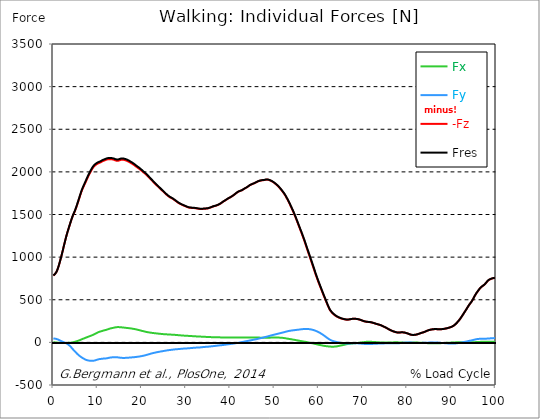
| Category |  Fx |  Fy |  -Fz |  Fres |
|---|---|---|---|---|
| 0.0 | 1.08 | 46.46 | 783.31 | 784.85 |
| 0.1646090534979424 | 0.5 | 45.14 | 791.34 | 792.79 |
| 0.3292181069958848 | -0.08 | 43.83 | 799.38 | 800.73 |
| 0.5041152263374485 | -0.64 | 42.35 | 808.45 | 809.69 |
| 0.668724279835391 | -1.29 | 40.46 | 822.41 | 823.54 |
| 0.8333333333333333 | -2.3 | 37.87 | 841.13 | 842.12 |
| 0.9979423868312757 | -3.42 | 34.49 | 864.68 | 865.53 |
| 1.162551440329218 | -4.56 | 30.8 | 890.39 | 891.1 |
| 1.337448559670782 | -5.6 | 26.63 | 919.9 | 920.49 |
| 1.5020576131687242 | -6.56 | 22.34 | 950.5 | 950.99 |
| 1.6666666666666665 | -7.1 | 17.97 | 982.89 | 983.27 |
| 1.831275720164609 | -7.52 | 13.86 | 1016.66 | 1016.96 |
| 1.9958847736625513 | -7.98 | 9.88 | 1050.57 | 1050.81 |
| 2.170781893004115 | -7.83 | 6.13 | 1085.99 | 1086.18 |
| 2.3353909465020575 | -7.66 | 2.67 | 1121.96 | 1122.13 |
| 2.4999999999999996 | -7.46 | -0.9 | 1157.16 | 1157.31 |
| 2.6646090534979425 | -7.31 | -4.56 | 1192.47 | 1192.63 |
| 2.829218106995885 | -7.09 | -8.45 | 1226.81 | 1226.99 |
| 3.0041152263374484 | -6.83 | -13.2 | 1258.89 | 1259.14 |
| 3.168724279835391 | -6.42 | -18.64 | 1289.01 | 1289.35 |
| 3.333333333333333 | -5.85 | -24.58 | 1317.21 | 1317.68 |
| 3.497942386831276 | -5.23 | -30.91 | 1344.87 | 1345.48 |
| 3.662551440329218 | -4.57 | -37.94 | 1372.54 | 1373.36 |
| 3.837448559670782 | -3.75 | -46.22 | 1399.84 | 1400.98 |
| 4.002057613168724 | -2.88 | -55.55 | 1426.32 | 1427.86 |
| 4.166666666666667 | -1.84 | -65.66 | 1451.56 | 1453.55 |
| 4.3312757201646095 | -0.62 | -76.15 | 1476.06 | 1478.5 |
| 4.495884773662552 | 1.18 | -86.2 | 1498.1 | 1501.04 |
| 4.670781893004115 | 3.71 | -95.17 | 1517.16 | 1520.64 |
| 4.835390946502058 | 6.23 | -104.14 | 1536.21 | 1540.24 |
| 4.999999999999999 | 8.91 | -113.17 | 1558.21 | 1562.84 |
| 5.164609053497943 | 11.56 | -122.19 | 1582.37 | 1587.6 |
| 5.329218106995885 | 14.14 | -131.2 | 1607.65 | 1613.5 |
| 5.504115226337448 | 17.06 | -139.61 | 1633.36 | 1639.85 |
| 5.668724279835391 | 20.01 | -147.56 | 1659.43 | 1666.53 |
| 5.833333333333333 | 23.19 | -154.88 | 1686.28 | 1693.96 |
| 5.997942386831276 | 26.53 | -161.86 | 1713.54 | 1721.77 |
| 6.162551440329218 | 30.54 | -167.63 | 1740.51 | 1749.25 |
| 6.337448559670782 | 34.24 | -173.91 | 1765.51 | 1774.82 |
| 6.502057613168724 | 37.85 | -179.99 | 1788.21 | 1798.04 |
| 6.666666666666666 | 41.45 | -185.16 | 1808.55 | 1818.85 |
| 6.831275720164609 | 44.85 | -190.07 | 1827.87 | 1838.62 |
| 6.995884773662552 | 48.04 | -194.78 | 1846.44 | 1857.62 |
| 7.170781893004115 | 51.56 | -199.68 | 1865.25 | 1876.85 |
| 7.3353909465020575 | 55.05 | -204.14 | 1884.24 | 1896.24 |
| 7.500000000000001 | 58.46 | -207.18 | 1903.75 | 1916.05 |
| 7.664609053497942 | 61.95 | -209.72 | 1923.15 | 1935.71 |
| 7.829218106995885 | 65.31 | -211.62 | 1941.64 | 1954.38 |
| 8.004115226337449 | 68.63 | -213.26 | 1959.13 | 1972.05 |
| 8.168724279835391 | 71.96 | -214.74 | 1976.33 | 1989.41 |
| 8.333333333333334 | 75.1 | -215.53 | 1993.02 | 2006.19 |
| 8.497942386831278 | 78.24 | -215.84 | 2009.23 | 2022.44 |
| 8.662551440329219 | 81.34 | -215.88 | 2025.05 | 2038.29 |
| 8.837448559670783 | 84.87 | -215.75 | 2039.29 | 2052.57 |
| 9.002057613168725 | 88.82 | -215.52 | 2052.07 | 2065.41 |
| 9.166666666666668 | 92.97 | -214.73 | 2063.45 | 2076.82 |
| 9.33127572016461 | 97.17 | -212.85 | 2072.36 | 2085.7 |
| 9.495884773662551 | 101.88 | -210.24 | 2079.29 | 2092.57 |
| 9.670781893004117 | 106.45 | -207.43 | 2085.62 | 2098.84 |
| 9.83539094650206 | 110.84 | -204.61 | 2091.74 | 2104.9 |
| 9.999999999999998 | 115.72 | -201.67 | 2096.78 | 2109.91 |
| 10.16460905349794 | 119.63 | -199.12 | 2101.18 | 2114.27 |
| 10.329218106995887 | 122.93 | -196.95 | 2104.66 | 2117.74 |
| 10.504115226337447 | 125.93 | -194.96 | 2107.68 | 2120.77 |
| 10.66872427983539 | 128.24 | -194.04 | 2111.69 | 2124.83 |
| 10.833333333333334 | 130.44 | -193.43 | 2116.26 | 2129.46 |
| 10.997942386831275 | 132.83 | -192.88 | 2121.5 | 2134.76 |
| 11.162551440329217 | 135.83 | -191.75 | 2125.97 | 2139.27 |
| 11.337448559670783 | 139.35 | -189.95 | 2129.77 | 2143.1 |
| 11.502057613168724 | 141.45 | -189.66 | 2131.91 | 2145.33 |
| 11.666666666666666 | 142.97 | -189.77 | 2136.55 | 2150.03 |
| 11.831275720164609 | 144.97 | -189.06 | 2140.52 | 2154.03 |
| 11.995884773662551 | 147.75 | -187.49 | 2143.53 | 2157.06 |
| 12.170781893004115 | 150.92 | -185.46 | 2145.81 | 2159.36 |
| 12.335390946502057 | 153.57 | -183.84 | 2147.81 | 2161.39 |
| 12.5 | 157.15 | -181.51 | 2149.02 | 2162.63 |
| 12.664609053497943 | 159.87 | -179.78 | 2149.58 | 2163.26 |
| 12.829218106995885 | 162.52 | -178.17 | 2149.66 | 2163.41 |
| 13.004115226337449 | 164.75 | -177.25 | 2149.22 | 2163.09 |
| 13.168724279835391 | 166.68 | -176.24 | 2148.14 | 2162.08 |
| 13.333333333333332 | 168.49 | -175.4 | 2146.77 | 2160.78 |
| 13.497942386831276 | 170.23 | -174.85 | 2144.87 | 2158.99 |
| 13.662551440329217 | 171.94 | -174.46 | 2142.59 | 2156.83 |
| 13.837448559670783 | 173.79 | -174.34 | 2139.29 | 2153.7 |
| 14.002057613168724 | 175.8 | -174.27 | 2135.51 | 2150.1 |
| 14.166666666666666 | 177.57 | -174.35 | 2132.27 | 2147.03 |
| 14.33127572016461 | 178.51 | -174.81 | 2130.11 | 2145 |
| 14.495884773662551 | 178.99 | -175.42 | 2129.68 | 2144.67 |
| 14.670781893004115 | 179.38 | -176.42 | 2130.7 | 2145.79 |
| 14.835390946502057 | 179.14 | -177.7 | 2133 | 2148.15 |
| 15.000000000000002 | 178.48 | -178.98 | 2136.27 | 2151.44 |
| 15.164609053497943 | 177.73 | -180.11 | 2139.85 | 2155.03 |
| 15.329218106995883 | 176.73 | -181.05 | 2142.15 | 2157.29 |
| 15.504115226337449 | 175.98 | -181.73 | 2142.82 | 2157.96 |
| 15.66872427983539 | 174.97 | -182.15 | 2142.66 | 2157.75 |
| 15.833333333333334 | 174.03 | -182.2 | 2141.8 | 2156.82 |
| 15.997942386831276 | 173.21 | -182.17 | 2140.07 | 2155.03 |
| 16.162551440329217 | 172 | -182.1 | 2137.96 | 2152.83 |
| 16.337448559670783 | 170.82 | -181.73 | 2135.44 | 2150.21 |
| 16.502057613168724 | 169.79 | -181.13 | 2132.71 | 2147.37 |
| 16.666666666666668 | 168.99 | -180.72 | 2129.21 | 2143.8 |
| 16.83127572016461 | 168.16 | -180.08 | 2125 | 2139.49 |
| 16.995884773662556 | 167.13 | -179.4 | 2120.45 | 2134.84 |
| 17.170781893004115 | 166.16 | -178.72 | 2115.46 | 2129.75 |
| 17.33539094650206 | 164.96 | -177.91 | 2110.34 | 2124.5 |
| 17.500000000000004 | 163.82 | -177.07 | 2105.29 | 2119.33 |
| 17.66460905349794 | 162.55 | -176.3 | 2100.06 | 2113.98 |
| 17.82921810699589 | 161.08 | -175.57 | 2094.71 | 2108.49 |
| 18.00411522633745 | 159.56 | -174.89 | 2089.19 | 2102.82 |
| 18.16872427983539 | 158 | -174.18 | 2083.58 | 2097.07 |
| 18.333333333333336 | 156.2 | -173.31 | 2077.33 | 2090.65 |
| 18.497942386831276 | 154.45 | -172.4 | 2070.66 | 2083.82 |
| 18.66255144032922 | 152.75 | -171.33 | 2063.84 | 2076.83 |
| 18.837448559670786 | 150.91 | -170.15 | 2057.31 | 2070.11 |
| 19.002057613168724 | 148.95 | -168.96 | 2051.1 | 2063.69 |
| 19.166666666666668 | 146.61 | -167.85 | 2045.44 | 2057.8 |
| 19.331275720164612 | 144.28 | -166.6 | 2039.35 | 2051.48 |
| 19.495884773662553 | 142.01 | -165.24 | 2032.73 | 2044.63 |
| 19.67078189300412 | 139.77 | -163.84 | 2025.78 | 2037.45 |
| 19.83539094650206 | 137.47 | -162.34 | 2018.65 | 2030.08 |
| 19.999999999999996 | 135.36 | -160.62 | 2011.25 | 2022.44 |
| 20.164609053497944 | 133.26 | -158.75 | 2003.73 | 2014.68 |
| 20.32921810699588 | 131.14 | -156.82 | 1996.4 | 2007.11 |
| 20.504115226337447 | 129 | -154.73 | 1989 | 1999.45 |
| 20.66872427983539 | 126.94 | -152.57 | 1982.1 | 1992.29 |
| 20.833333333333332 | 124.96 | -150.4 | 1975.33 | 1985.26 |
| 20.997942386831276 | 122.78 | -148.13 | 1967.81 | 1977.45 |
| 21.162551440329217 | 121.03 | -145.78 | 1959.53 | 1968.92 |
| 21.33744855967078 | 119.38 | -143.3 | 1950.6 | 1959.74 |
| 21.502057613168724 | 117.92 | -140.84 | 1941.75 | 1950.65 |
| 21.666666666666668 | 116.48 | -138.32 | 1932.56 | 1941.24 |
| 21.83127572016461 | 115.03 | -135.53 | 1923.08 | 1931.52 |
| 21.99588477366255 | 113.64 | -132.97 | 1913.92 | 1922.13 |
| 22.170781893004115 | 112.36 | -130.65 | 1905.2 | 1913.21 |
| 22.335390946502056 | 111.23 | -128.33 | 1896.55 | 1904.37 |
| 22.5 | 110.14 | -126.1 | 1887.71 | 1895.34 |
| 22.664609053497944 | 109.05 | -124.01 | 1878.65 | 1886.12 |
| 22.82921810699588 | 108.09 | -122.04 | 1869.71 | 1877.02 |
| 23.004115226337447 | 107.2 | -120.23 | 1860.94 | 1868.12 |
| 23.16872427983539 | 106.12 | -118.31 | 1852.09 | 1859.12 |
| 23.333333333333332 | 105.14 | -116.43 | 1843.77 | 1850.66 |
| 23.497942386831276 | 104.08 | -114.47 | 1836.31 | 1843.04 |
| 23.662551440329217 | 103.1 | -112.66 | 1827.95 | 1834.54 |
| 23.83744855967078 | 102.2 | -110.98 | 1819.43 | 1825.89 |
| 24.002057613168727 | 101.29 | -109.52 | 1811.26 | 1817.62 |
| 24.166666666666664 | 100.33 | -108.02 | 1803.05 | 1809.29 |
| 24.33127572016461 | 99.35 | -106.47 | 1794.86 | 1800.98 |
| 24.495884773662553 | 98.46 | -104.9 | 1786.4 | 1792.41 |
| 24.670781893004115 | 97.56 | -103.45 | 1778.11 | 1784.01 |
| 24.83539094650206 | 96.74 | -101.95 | 1769.78 | 1775.57 |
| 25.0 | 96.04 | -100.41 | 1761.46 | 1767.15 |
| 25.164609053497944 | 95.48 | -98.8 | 1753.18 | 1758.78 |
| 25.329218106995885 | 94.97 | -97.15 | 1744.96 | 1750.46 |
| 25.504115226337447 | 94.45 | -95.66 | 1737.06 | 1742.48 |
| 25.66872427983539 | 93.93 | -94.26 | 1729.39 | 1734.74 |
| 25.833333333333332 | 93.49 | -92.88 | 1722.05 | 1727.32 |
| 25.997942386831276 | 92.97 | -91.64 | 1714.98 | 1720.19 |
| 26.16255144032922 | 92.4 | -90.47 | 1708.41 | 1713.56 |
| 26.337448559670783 | 91.79 | -89.44 | 1702.41 | 1707.49 |
| 26.502057613168724 | 91.32 | -88.45 | 1697.95 | 1702.97 |
| 26.666666666666664 | 90.84 | -87.46 | 1693.5 | 1698.46 |
| 26.83127572016461 | 90.38 | -86.4 | 1688.89 | 1693.78 |
| 26.995884773662553 | 89.96 | -85.21 | 1683.99 | 1688.8 |
| 27.170781893004115 | 89.39 | -84 | 1678.11 | 1682.85 |
| 27.33539094650206 | 88.8 | -82.84 | 1671.74 | 1676.4 |
| 27.499999999999996 | 88.19 | -81.84 | 1665.56 | 1670.16 |
| 27.66460905349794 | 87.39 | -81.11 | 1659.25 | 1663.8 |
| 27.829218106995885 | 86.59 | -80.42 | 1652.81 | 1657.3 |
| 28.004115226337447 | 85.77 | -79.7 | 1646.19 | 1650.62 |
| 28.16872427983539 | 84.9 | -79.01 | 1639.86 | 1644.22 |
| 28.333333333333332 | 84.11 | -78.19 | 1633.96 | 1638.26 |
| 28.49794238683128 | 83.35 | -77.42 | 1629.12 | 1633.35 |
| 28.66255144032922 | 82.66 | -76.6 | 1624.56 | 1628.74 |
| 28.837448559670783 | 81.96 | -75.66 | 1620.26 | 1624.37 |
| 29.002057613168724 | 81.28 | -74.89 | 1616.07 | 1620.13 |
| 29.166666666666664 | 80.61 | -74.17 | 1611.93 | 1615.94 |
| 29.331275720164612 | 79.98 | -73.41 | 1607.99 | 1611.95 |
| 29.495884773662553 | 79.31 | -72.78 | 1604.33 | 1608.24 |
| 29.670781893004115 | 78.68 | -72.3 | 1600.81 | 1604.68 |
| 29.835390946502056 | 78.13 | -71.74 | 1597.32 | 1601.14 |
| 30.000000000000004 | 77.64 | -71.26 | 1593.69 | 1597.48 |
| 30.164609053497944 | 77.19 | -70.82 | 1589.65 | 1593.41 |
| 30.329218106995885 | 76.69 | -70.25 | 1586.24 | 1589.95 |
| 30.504115226337447 | 76.19 | -69.54 | 1583.28 | 1586.95 |
| 30.66872427983539 | 75.71 | -68.74 | 1580.84 | 1584.45 |
| 30.833333333333336 | 75.17 | -67.97 | 1579.26 | 1582.82 |
| 30.99794238683128 | 74.58 | -67.17 | 1578.22 | 1581.72 |
| 31.162551440329217 | 74.13 | -66.35 | 1577.5 | 1580.95 |
| 31.33744855967078 | 73.54 | -65.65 | 1576.97 | 1580.37 |
| 31.50205761316873 | 73.03 | -64.85 | 1576.53 | 1579.87 |
| 31.666666666666668 | 72.56 | -63.99 | 1576.02 | 1579.31 |
| 31.831275720164612 | 72.07 | -63.17 | 1575.28 | 1578.52 |
| 31.995884773662553 | 71.47 | -62.47 | 1574.36 | 1577.54 |
| 32.17078189300411 | 70.79 | -61.88 | 1573.28 | 1576.41 |
| 32.33539094650206 | 70.11 | -61.42 | 1571.96 | 1575.05 |
| 32.5 | 69.63 | -60.99 | 1570.45 | 1573.5 |
| 32.66460905349794 | 69.3 | -60.61 | 1568.62 | 1571.65 |
| 32.82921810699589 | 68.89 | -60.19 | 1567.06 | 1570.05 |
| 33.00411522633745 | 68.41 | -59.7 | 1566.01 | 1568.96 |
| 33.168724279835395 | 67.98 | -59.14 | 1565.32 | 1568.23 |
| 33.333333333333336 | 67.49 | -58.28 | 1565.14 | 1567.99 |
| 33.49794238683128 | 67.08 | -57.28 | 1565.21 | 1567.99 |
| 33.66255144032922 | 66.7 | -56.15 | 1565.4 | 1568.11 |
| 33.83744855967078 | 66.34 | -55.18 | 1565.84 | 1568.5 |
| 34.00205761316873 | 65.77 | -54.33 | 1566.59 | 1569.2 |
| 34.16666666666667 | 65.17 | -53.54 | 1567.41 | 1569.96 |
| 34.331275720164605 | 64.67 | -52.95 | 1568.22 | 1570.73 |
| 34.49588477366255 | 64.26 | -52.37 | 1569.02 | 1571.49 |
| 34.67078189300412 | 64.14 | -51.81 | 1569.75 | 1572.2 |
| 34.83539094650206 | 63.89 | -51.26 | 1570.86 | 1573.29 |
| 35.00000000000001 | 63.55 | -50.54 | 1572.48 | 1574.86 |
| 35.16460905349794 | 63.08 | -49.57 | 1574.96 | 1577.3 |
| 35.32921810699588 | 62.53 | -48.54 | 1577.88 | 1580.16 |
| 35.504115226337454 | 61.94 | -47.51 | 1581.1 | 1583.32 |
| 35.668724279835395 | 61.44 | -46.65 | 1584.48 | 1586.65 |
| 35.833333333333336 | 61.01 | -45.88 | 1587.96 | 1590.09 |
| 35.99794238683128 | 60.82 | -44.98 | 1591.64 | 1593.74 |
| 36.16255144032922 | 60.6 | -44 | 1594.65 | 1596.7 |
| 36.33744855967078 | 60.34 | -43.01 | 1597.42 | 1599.43 |
| 36.50205761316873 | 60.12 | -42.02 | 1599.78 | 1601.75 |
| 36.66666666666667 | 59.96 | -40.91 | 1601.81 | 1603.76 |
| 36.831275720164605 | 59.72 | -39.79 | 1604.64 | 1606.54 |
| 36.99588477366255 | 59.48 | -38.72 | 1607.87 | 1609.75 |
| 37.17078189300412 | 59.27 | -37.65 | 1611.36 | 1613.21 |
| 37.33539094650206 | 59.05 | -36.58 | 1615.29 | 1617.11 |
| 37.5 | 58.89 | -35.53 | 1619.8 | 1621.59 |
| 37.66460905349794 | 58.71 | -34.65 | 1624.61 | 1626.37 |
| 37.82921810699589 | 58.5 | -33.79 | 1629.58 | 1631.32 |
| 38.00411522633745 | 58.27 | -32.87 | 1635.46 | 1637.17 |
| 38.168724279835395 | 58 | -31.85 | 1642.37 | 1644.07 |
| 38.333333333333336 | 57.92 | -30.87 | 1648.43 | 1650.1 |
| 38.49794238683127 | 57.92 | -29.72 | 1653.79 | 1655.43 |
| 38.662551440329224 | 57.86 | -28.51 | 1659.13 | 1660.74 |
| 38.83744855967078 | 57.75 | -27.41 | 1664.81 | 1666.4 |
| 39.00205761316872 | 57.63 | -26.29 | 1670.37 | 1671.94 |
| 39.16666666666667 | 57.51 | -25 | 1675.92 | 1677.46 |
| 39.331275720164605 | 57.4 | -23.74 | 1681.38 | 1682.88 |
| 39.49588477366255 | 57.34 | -22.51 | 1686.96 | 1688.44 |
| 39.67078189300412 | 57.3 | -21.39 | 1692.6 | 1694.06 |
| 39.83539094650206 | 57.19 | -20.28 | 1697.4 | 1698.84 |
| 39.99999999999999 | 57.11 | -19.23 | 1701.33 | 1702.76 |
| 40.16460905349794 | 57.01 | -18.14 | 1706.11 | 1707.52 |
| 40.32921810699589 | 56.89 | -16.95 | 1711.61 | 1713.01 |
| 40.50411522633745 | 56.78 | -15.73 | 1717.27 | 1718.66 |
| 40.668724279835395 | 56.78 | -14.51 | 1723.29 | 1724.67 |
| 40.83333333333333 | 56.8 | -13.16 | 1729.89 | 1731.26 |
| 40.99794238683128 | 56.79 | -11.77 | 1736.44 | 1737.8 |
| 41.16255144032922 | 56.78 | -10.27 | 1743.26 | 1744.63 |
| 41.33744855967078 | 56.74 | -8.83 | 1750.3 | 1751.65 |
| 41.50205761316872 | 56.82 | -7.5 | 1756.87 | 1758.21 |
| 41.666666666666664 | 57 | -6.15 | 1762.78 | 1764.14 |
| 41.83127572016461 | 57.09 | -4.49 | 1767.82 | 1769.19 |
| 41.99588477366255 | 57.08 | -2.79 | 1771.92 | 1773.29 |
| 42.17078189300412 | 57.26 | -1.2 | 1775.43 | 1776.78 |
| 42.33539094650206 | 57.37 | 0.47 | 1778.54 | 1779.87 |
| 42.5 | 57.53 | 2.21 | 1781.47 | 1782.79 |
| 42.66460905349794 | 57.83 | 3.91 | 1784.99 | 1786.31 |
| 42.82921810699589 | 57.91 | 5.58 | 1790.17 | 1791.5 |
| 43.00411522633745 | 57.8 | 7.49 | 1796.35 | 1797.68 |
| 43.16872427983539 | 57.63 | 9.42 | 1802.36 | 1803.68 |
| 43.333333333333336 | 57.68 | 11.13 | 1807.2 | 1808.52 |
| 43.49794238683128 | 57.93 | 12.65 | 1811.52 | 1812.85 |
| 43.66255144032922 | 58.14 | 14.19 | 1815.99 | 1817.33 |
| 43.83744855967078 | 58.22 | 15.9 | 1821.34 | 1822.7 |
| 44.00205761316873 | 58.33 | 17.67 | 1827.71 | 1829.09 |
| 44.166666666666664 | 58.35 | 19.43 | 1834.47 | 1835.86 |
| 44.33127572016461 | 58.23 | 21.24 | 1840.68 | 1842.07 |
| 44.49588477366255 | 57.99 | 23.1 | 1845.73 | 1847.12 |
| 44.67078189300411 | 57.76 | 24.72 | 1850.16 | 1851.57 |
| 44.835390946502066 | 57.78 | 26.24 | 1853.91 | 1855.34 |
| 45.0 | 57.91 | 27.94 | 1857.18 | 1858.65 |
| 45.16460905349794 | 58.1 | 29.65 | 1860.64 | 1862.13 |
| 45.32921810699589 | 58.04 | 31.44 | 1864.72 | 1866.24 |
| 45.504115226337454 | 57.88 | 33.32 | 1868.8 | 1870.34 |
| 45.668724279835395 | 57.7 | 35.21 | 1872.89 | 1874.45 |
| 45.83333333333333 | 57.46 | 36.92 | 1877.17 | 1878.75 |
| 45.99794238683128 | 57.07 | 38.75 | 1881.47 | 1883.07 |
| 46.16255144032922 | 56.45 | 40.78 | 1885.8 | 1887.41 |
| 46.33744855967078 | 56.13 | 42.89 | 1889.78 | 1891.41 |
| 46.50205761316873 | 55.85 | 45.03 | 1893.23 | 1894.89 |
| 46.666666666666664 | 55.66 | 47.21 | 1895.86 | 1897.55 |
| 46.831275720164605 | 55.52 | 49.17 | 1897.7 | 1899.41 |
| 46.99588477366255 | 55.44 | 51.15 | 1899.71 | 1901.45 |
| 47.17078189300412 | 55.52 | 53.23 | 1901.3 | 1903.09 |
| 47.33539094650206 | 55.53 | 55.24 | 1902.2 | 1904.04 |
| 47.5 | 55.64 | 57.26 | 1902.71 | 1904.59 |
| 47.66460905349794 | 55.76 | 59.39 | 1903.73 | 1905.66 |
| 47.82921810699588 | 55.57 | 61.44 | 1905.85 | 1907.82 |
| 48.004115226337454 | 55.31 | 63.56 | 1907.91 | 1909.93 |
| 48.168724279835395 | 54.88 | 65.81 | 1909.48 | 1911.55 |
| 48.33333333333333 | 54.59 | 68.08 | 1909.77 | 1911.92 |
| 48.49794238683128 | 54.69 | 70.48 | 1908.29 | 1910.53 |
| 48.66255144032922 | 54.94 | 72.94 | 1905.99 | 1908.33 |
| 48.83744855967078 | 55.2 | 75.61 | 1903 | 1905.45 |
| 49.00205761316873 | 55.53 | 78.12 | 1899.67 | 1902.24 |
| 49.166666666666664 | 55.81 | 80.5 | 1895.74 | 1898.43 |
| 49.331275720164605 | 56.08 | 82.77 | 1891.55 | 1894.35 |
| 49.49588477366255 | 56.15 | 84.92 | 1886.59 | 1889.49 |
| 49.67078189300412 | 56.18 | 87 | 1881.35 | 1884.36 |
| 49.83539094650206 | 56.15 | 88.99 | 1875.75 | 1878.87 |
| 50.0 | 56.11 | 91.15 | 1869.01 | 1872.25 |
| 50.16460905349794 | 56.43 | 93.51 | 1862.11 | 1865.49 |
| 50.32921810699589 | 56.51 | 95.78 | 1855.12 | 1858.61 |
| 50.504115226337454 | 56.47 | 97.85 | 1847.51 | 1851.12 |
| 50.668724279835395 | 56.37 | 99.96 | 1839.21 | 1842.96 |
| 50.83333333333333 | 56.16 | 102.04 | 1830.63 | 1834.5 |
| 50.99794238683128 | 55.95 | 104.06 | 1821.62 | 1825.62 |
| 51.162551440329224 | 55.65 | 106.17 | 1811.54 | 1815.67 |
| 51.33744855967078 | 55.25 | 108.25 | 1801.35 | 1805.61 |
| 51.50205761316873 | 54.69 | 110.37 | 1790.87 | 1795.26 |
| 51.666666666666664 | 53.95 | 112.63 | 1779.9 | 1784.44 |
| 51.83127572016461 | 53.07 | 114.96 | 1768.86 | 1773.53 |
| 51.99588477366255 | 51.92 | 117.16 | 1757.02 | 1761.84 |
| 52.17078189300412 | 50.7 | 119.53 | 1744.68 | 1749.66 |
| 52.335390946502066 | 49.35 | 121.82 | 1731.48 | 1736.61 |
| 52.5 | 47.87 | 124.14 | 1717.24 | 1722.55 |
| 52.66460905349795 | 46.25 | 126.55 | 1701.76 | 1707.24 |
| 52.82921810699588 | 44.68 | 128.89 | 1685.92 | 1691.59 |
| 53.00411522633745 | 43.16 | 131.06 | 1669.81 | 1675.66 |
| 53.1687242798354 | 41.63 | 133.07 | 1652.93 | 1658.96 |
| 53.33333333333333 | 40.17 | 134.79 | 1635.18 | 1641.38 |
| 53.49794238683128 | 38.73 | 136.19 | 1616.73 | 1623.08 |
| 53.66255144032922 | 37.31 | 137.53 | 1598.19 | 1604.69 |
| 53.83744855967078 | 35.85 | 138.81 | 1578.98 | 1585.64 |
| 54.00205761316873 | 34.43 | 140.04 | 1560.24 | 1567.06 |
| 54.166666666666664 | 32.98 | 141.19 | 1540.63 | 1547.6 |
| 54.33127572016461 | 31.43 | 142.23 | 1520.7 | 1527.83 |
| 54.495884773662546 | 29.84 | 143.34 | 1499.95 | 1507.24 |
| 54.67078189300412 | 28.2 | 144.38 | 1478.45 | 1485.92 |
| 54.835390946502066 | 26.53 | 145.48 | 1456.65 | 1464.29 |
| 54.99999999999999 | 24.92 | 146.54 | 1434.31 | 1442.15 |
| 55.16460905349795 | 23.28 | 147.56 | 1411.92 | 1419.96 |
| 55.32921810699588 | 21.67 | 148.59 | 1388.83 | 1397.09 |
| 55.50411522633745 | 20.06 | 149.67 | 1366.18 | 1374.67 |
| 55.668724279835395 | 18.48 | 150.81 | 1343.31 | 1352.06 |
| 55.83333333333333 | 16.93 | 152 | 1320.58 | 1329.6 |
| 55.99794238683128 | 15.4 | 153.27 | 1298.49 | 1307.8 |
| 56.162551440329224 | 13.83 | 154.28 | 1275.6 | 1285.19 |
| 56.33744855967078 | 12.28 | 155.23 | 1252.03 | 1261.89 |
| 56.50205761316873 | 10.74 | 155.97 | 1227.92 | 1238.06 |
| 56.666666666666664 | 9.14 | 156.7 | 1204.02 | 1214.43 |
| 56.83127572016461 | 7.57 | 157.01 | 1179.13 | 1189.79 |
| 56.99588477366256 | 6.01 | 157.08 | 1153.44 | 1164.34 |
| 57.17078189300412 | 4.4 | 156.92 | 1127.5 | 1138.62 |
| 57.335390946502066 | 2.76 | 156.78 | 1101.58 | 1112.92 |
| 57.49999999999999 | 1.12 | 156.6 | 1075.91 | 1087.47 |
| 57.66460905349794 | -0.55 | 156.2 | 1050.15 | 1061.91 |
| 57.829218106995896 | -2.24 | 155.41 | 1024.73 | 1036.65 |
| 58.00411522633745 | -4.03 | 154.29 | 999.78 | 1011.82 |
| 58.168724279835395 | -5.9 | 152.72 | 974.38 | 986.5 |
| 58.33333333333333 | -7.84 | 150.92 | 948.78 | 960.95 |
| 58.49794238683128 | -9.8 | 148.94 | 922.92 | 935.11 |
| 58.662551440329224 | -11.78 | 146.89 | 897.18 | 909.39 |
| 58.83744855967078 | -13.81 | 144.58 | 871.45 | 883.65 |
| 59.00205761316873 | -15.87 | 141.78 | 845.48 | 857.6 |
| 59.16666666666666 | -17.92 | 138.6 | 819.09 | 831.09 |
| 59.33127572016461 | -19.92 | 135.21 | 793.35 | 805.2 |
| 59.49588477366256 | -21.95 | 131.47 | 768.65 | 780.27 |
| 59.67078189300411 | -23.92 | 127.59 | 744.5 | 755.88 |
| 59.835390946502066 | -25.89 | 123.54 | 720.87 | 731.98 |
| 60.00000000000001 | -27.78 | 119.24 | 697.88 | 708.68 |
| 60.16460905349794 | -29.64 | 114.75 | 675.79 | 686.23 |
| 60.32921810699589 | -31.42 | 109.73 | 653.75 | 663.79 |
| 60.50411522633745 | -33.23 | 104.4 | 631.79 | 641.4 |
| 60.66872427983539 | -35.01 | 98.82 | 609.76 | 618.91 |
| 60.833333333333336 | -36.81 | 93.19 | 587.74 | 596.43 |
| 60.99794238683128 | -38.6 | 87.5 | 565.97 | 574.2 |
| 61.162551440329224 | -40.19 | 81.51 | 544.42 | 552.2 |
| 61.33744855967078 | -41.67 | 75.31 | 523.02 | 530.34 |
| 61.50205761316872 | -43.02 | 68.86 | 501.88 | 508.73 |
| 61.66666666666667 | -44.1 | 62.29 | 480.71 | 487.14 |
| 61.831275720164605 | -45.08 | 55.8 | 459.79 | 465.83 |
| 61.99588477366256 | -46.12 | 49.44 | 439.1 | 444.78 |
| 62.17078189300411 | -47.24 | 43.32 | 419.11 | 424.46 |
| 62.33539094650205 | -48.22 | 37.6 | 400.39 | 405.48 |
| 62.50000000000001 | -49.18 | 32.13 | 383.02 | 387.88 |
| 62.66460905349794 | -49.77 | 27.83 | 369.6 | 374.31 |
| 62.82921810699589 | -50.18 | 23.7 | 358.08 | 362.65 |
| 63.00411522633746 | -50.48 | 20 | 347.6 | 352.07 |
| 63.16872427983539 | -50.45 | 17.1 | 339.28 | 343.7 |
| 63.333333333333336 | -50.28 | 14.4 | 331.71 | 336.07 |
| 63.49794238683128 | -49.98 | 11.72 | 324.3 | 328.58 |
| 63.662551440329224 | -49.55 | 9.11 | 317.12 | 321.32 |
| 63.83744855967079 | -48.84 | 6.73 | 310.64 | 314.73 |
| 64.00205761316873 | -47.58 | 4.82 | 305.17 | 309.09 |
| 64.16666666666667 | -46.01 | 2.98 | 300.37 | 304.08 |
| 64.3312757201646 | -44.19 | 1.11 | 296.03 | 299.51 |
| 64.49588477366255 | -42.23 | -0.73 | 292.03 | 295.3 |
| 64.67078189300412 | -40.27 | -2.59 | 288.29 | 291.35 |
| 64.83539094650206 | -38.41 | -4.32 | 284.8 | 287.66 |
| 65.0 | -36.52 | -5.9 | 281.63 | 284.3 |
| 65.16460905349794 | -34.76 | -7.11 | 279.13 | 281.64 |
| 65.32921810699588 | -32.94 | -8.39 | 276.59 | 278.94 |
| 65.50411522633745 | -31.04 | -9.53 | 274.26 | 276.42 |
| 65.66872427983539 | -29.14 | -10.42 | 272.21 | 274.21 |
| 65.83333333333334 | -27.18 | -11.17 | 270.44 | 272.29 |
| 65.99794238683127 | -25.26 | -11.83 | 268.79 | 270.5 |
| 66.16255144032922 | -23.36 | -12.37 | 267.29 | 268.85 |
| 66.33744855967079 | -21.46 | -12.87 | 266.32 | 267.76 |
| 66.50205761316873 | -19.67 | -13.24 | 265.92 | 267.26 |
| 66.66666666666667 | -18.17 | -13.05 | 266.77 | 268.02 |
| 66.8312757201646 | -16.82 | -12.82 | 268.01 | 269.16 |
| 66.99588477366255 | -15.63 | -12.28 | 269.57 | 270.63 |
| 67.17078189300412 | -14.52 | -11.76 | 271.4 | 272.38 |
| 67.33539094650206 | -13.59 | -11.46 | 273.11 | 274.01 |
| 67.5 | -12.71 | -11.12 | 274.71 | 275.54 |
| 67.66460905349794 | -11.94 | -10.69 | 276.11 | 276.87 |
| 67.8292181069959 | -11.36 | -10.56 | 276.79 | 277.5 |
| 68.00411522633746 | -10.75 | -10.38 | 277.05 | 277.71 |
| 68.16872427983539 | -10.06 | -10.21 | 277 | 277.61 |
| 68.33333333333334 | -9.21 | -10.32 | 276.16 | 276.74 |
| 68.49794238683127 | -8.31 | -10.58 | 275.07 | 275.62 |
| 68.66255144032921 | -7.38 | -10.92 | 273.88 | 274.41 |
| 68.83744855967078 | -6.6 | -11.39 | 272.25 | 272.77 |
| 69.00205761316872 | -5.26 | -11.96 | 270.23 | 270.76 |
| 69.16666666666667 | -3.88 | -12.6 | 268.07 | 268.62 |
| 69.33127572016461 | -2.7 | -13.23 | 265.47 | 266.08 |
| 69.49588477366255 | -1.58 | -14.01 | 262.41 | 263.07 |
| 69.67078189300412 | -0.75 | -14.82 | 259.05 | 259.75 |
| 69.83539094650206 | 0.13 | -15.67 | 255.54 | 256.31 |
| 70.00000000000001 | 1.18 | -16.49 | 252.22 | 253.05 |
| 70.16460905349794 | 2.2 | -17.25 | 249.25 | 250.12 |
| 70.32921810699588 | 3.46 | -17.94 | 246.6 | 247.52 |
| 70.50411522633745 | 4.84 | -18.27 | 244.57 | 245.52 |
| 70.66872427983539 | 5.81 | -18.65 | 242.75 | 243.76 |
| 70.83333333333333 | 6.37 | -18.78 | 241.35 | 242.38 |
| 70.99794238683128 | 6.96 | -18.82 | 240.21 | 241.27 |
| 71.16255144032922 | 7.24 | -18.71 | 239.37 | 240.44 |
| 71.33744855967079 | 7.4 | -18.57 | 238.72 | 239.8 |
| 71.50205761316873 | 7.28 | -18.38 | 237.82 | 238.88 |
| 71.66666666666667 | 6.82 | -18.13 | 236.61 | 237.64 |
| 71.83127572016461 | 6.35 | -17.98 | 235.02 | 236.03 |
| 71.99588477366255 | 5.89 | -17.93 | 233.03 | 234.05 |
| 72.17078189300412 | 5.5 | -17.87 | 230.44 | 231.45 |
| 72.33539094650205 | 5.05 | -17.51 | 228.07 | 229.04 |
| 72.5 | 4.47 | -17 | 225.8 | 226.71 |
| 72.66460905349795 | 3.9 | -16.72 | 223.01 | 223.88 |
| 72.82921810699588 | 3.33 | -16.46 | 219.94 | 220.78 |
| 73.00411522633746 | 2.68 | -15.99 | 216.91 | 217.68 |
| 73.1687242798354 | 2.08 | -15.49 | 214.28 | 215.01 |
| 73.33333333333334 | 1.47 | -14.8 | 212.05 | 212.7 |
| 73.49794238683127 | 0.87 | -14.14 | 209.74 | 210.33 |
| 73.66255144032921 | 0.27 | -13.56 | 207.21 | 207.77 |
| 73.83744855967078 | -0.22 | -13.07 | 204.48 | 205.01 |
| 74.00205761316873 | -0.61 | -12.63 | 201.61 | 202.12 |
| 74.16666666666667 | -0.83 | -12.36 | 197.83 | 198.35 |
| 74.33127572016461 | -0.98 | -12.22 | 193.81 | 194.35 |
| 74.49588477366255 | -1.07 | -12.27 | 189.67 | 190.24 |
| 74.67078189300412 | -1.23 | -12.1 | 185.66 | 186.26 |
| 74.83539094650207 | -1.4 | -11.81 | 181.6 | 182.22 |
| 75.0 | -1.58 | -11.47 | 177.48 | 178.1 |
| 75.16460905349794 | -1.7 | -11.15 | 173.23 | 173.87 |
| 75.32921810699588 | -1.72 | -10.87 | 168.54 | 169.19 |
| 75.50411522633745 | -1.63 | -10.62 | 163.52 | 164.18 |
| 75.6687242798354 | -1.48 | -10.54 | 158.52 | 159.2 |
| 75.83333333333333 | -1.33 | -10.49 | 153.65 | 154.35 |
| 75.99794238683128 | -1.22 | -10.44 | 149.14 | 149.85 |
| 76.16255144032922 | -1.04 | -10.48 | 144.78 | 145.52 |
| 76.33744855967079 | -0.78 | -10.53 | 140.57 | 141.35 |
| 76.50205761316873 | -0.46 | -10.63 | 136.38 | 137.19 |
| 76.66666666666667 | -0.14 | -10.76 | 132.45 | 133.29 |
| 76.83127572016461 | 0.11 | -10.92 | 129.13 | 130.01 |
| 76.99588477366254 | 0.11 | -10.84 | 126.35 | 127.25 |
| 77.17078189300412 | 0.16 | -10.91 | 123.6 | 124.52 |
| 77.33539094650206 | 0.21 | -10.87 | 120.97 | 121.91 |
| 77.5 | 0.25 | -10.76 | 118.64 | 119.58 |
| 77.66460905349794 | 0.27 | -10.63 | 116.56 | 117.49 |
| 77.82921810699588 | 0.25 | -10.53 | 115.19 | 116.1 |
| 78.00411522633745 | -0.06 | -9.99 | 114.91 | 115.72 |
| 78.1687242798354 | -0.44 | -9.32 | 115.32 | 116.05 |
| 78.33333333333334 | -0.83 | -8.65 | 116.13 | 116.78 |
| 78.49794238683127 | -1.28 | -7.88 | 116.83 | 117.41 |
| 78.66255144032921 | -1.87 | -6.91 | 117.33 | 117.83 |
| 78.83744855967078 | -2.39 | -5.89 | 117.57 | 118.02 |
| 79.00205761316873 | -2.87 | -4.88 | 117.52 | 117.95 |
| 79.16666666666667 | -3.38 | -4.12 | 116.65 | 117.08 |
| 79.33127572016461 | -3.79 | -3.58 | 115.37 | 115.82 |
| 79.49588477366257 | -4.12 | -3.11 | 113.8 | 114.26 |
| 79.67078189300412 | -4.3 | -2.6 | 111.49 | 111.95 |
| 79.83539094650207 | -4.5 | -2.04 | 108.83 | 109.27 |
| 79.99999999999999 | -4.53 | -1.73 | 106.13 | 106.58 |
| 80.16460905349794 | -4.5 | -1.44 | 103.22 | 103.67 |
| 80.32921810699588 | -4.35 | -1.46 | 99.78 | 100.24 |
| 80.50411522633745 | -4.14 | -1.61 | 96.29 | 96.75 |
| 80.66872427983539 | -3.8 | -1.97 | 92.79 | 93.24 |
| 80.83333333333333 | -3.49 | -2.33 | 89.81 | 90.26 |
| 80.99794238683128 | -3.18 | -2.84 | 88.1 | 88.55 |
| 81.16255144032922 | -2.94 | -3.52 | 87.35 | 87.8 |
| 81.33744855967079 | -2.69 | -4.23 | 87.09 | 87.53 |
| 81.50205761316873 | -2.5 | -4.97 | 87.29 | 87.74 |
| 81.66666666666666 | -2.33 | -5.75 | 87.87 | 88.33 |
| 81.83127572016461 | -2.35 | -6.22 | 88.89 | 89.36 |
| 81.99588477366255 | -2.37 | -6.66 | 90.37 | 90.87 |
| 82.1707818930041 | -2.48 | -6.99 | 92.34 | 92.86 |
| 82.33539094650206 | -2.79 | -6.99 | 94.81 | 95.32 |
| 82.5 | -3.21 | -6.65 | 97.62 | 98.1 |
| 82.66460905349794 | -3.53 | -6.58 | 100.6 | 101.06 |
| 82.8292181069959 | -3.88 | -6.54 | 103.71 | 104.16 |
| 83.00411522633745 | -4.39 | -6.32 | 107.13 | 107.56 |
| 83.1687242798354 | -4.84 | -6.18 | 110.4 | 110.84 |
| 83.33333333333333 | -5.21 | -5.97 | 113.18 | 113.62 |
| 83.49794238683127 | -5.61 | -5.64 | 115.34 | 115.78 |
| 83.66255144032922 | -6.05 | -5.2 | 117.51 | 117.94 |
| 83.83744855967078 | -6.54 | -4.76 | 120.72 | 121.14 |
| 84.00205761316873 | -7.07 | -4.3 | 124.28 | 124.71 |
| 84.16666666666667 | -7.63 | -4.05 | 128.25 | 128.69 |
| 84.33127572016461 | -8.17 | -3.86 | 132.28 | 132.73 |
| 84.49588477366257 | -8.65 | -3.57 | 135.96 | 136.42 |
| 84.67078189300412 | -9.13 | -3.21 | 139.3 | 139.76 |
| 84.83539094650206 | -9.5 | -2.9 | 142.3 | 142.77 |
| 85.0 | -9.89 | -2.55 | 145.06 | 145.54 |
| 85.16460905349794 | -10.25 | -2.26 | 147.46 | 147.96 |
| 85.32921810699588 | -10.52 | -2.11 | 149.45 | 149.97 |
| 85.50411522633745 | -10.72 | -1.98 | 151.05 | 151.59 |
| 85.66872427983539 | -10.95 | -1.95 | 152.22 | 152.78 |
| 85.83333333333334 | -11.17 | -1.77 | 153.4 | 153.97 |
| 85.99794238683128 | -11.32 | -1.41 | 154.59 | 155.18 |
| 86.16255144032922 | -11.23 | -1.4 | 155.35 | 155.94 |
| 86.33744855967078 | -11.18 | -1.52 | 155.61 | 156.22 |
| 86.50205761316873 | -11.06 | -1.67 | 155.59 | 156.2 |
| 86.66666666666667 | -10.91 | -1.92 | 155.24 | 155.87 |
| 86.8312757201646 | -10.64 | -2.37 | 154.53 | 155.15 |
| 86.99588477366255 | -10.28 | -3.13 | 153.84 | 154.45 |
| 87.17078189300412 | -9.89 | -4.06 | 153.33 | 153.93 |
| 87.33539094650206 | -9.57 | -4.79 | 153.31 | 153.92 |
| 87.5 | -9.26 | -5.33 | 153.51 | 154.13 |
| 87.66460905349794 | -8.85 | -6.05 | 153.97 | 154.58 |
| 87.8292181069959 | -8.41 | -6.8 | 154.81 | 155.42 |
| 88.00411522633746 | -8 | -7.37 | 155.93 | 156.53 |
| 88.1687242798354 | -7.51 | -8.01 | 157.05 | 157.67 |
| 88.33333333333333 | -7.06 | -8.69 | 158.33 | 158.96 |
| 88.49794238683127 | -6.73 | -9.5 | 159.7 | 160.35 |
| 88.66255144032922 | -6.38 | -10.22 | 161.44 | 162.11 |
| 88.83744855967079 | -6.05 | -10.86 | 163.37 | 164.06 |
| 89.00205761316872 | -5.55 | -11.48 | 165.36 | 166.08 |
| 89.16666666666667 | -5.12 | -12.08 | 167.65 | 168.4 |
| 89.33127572016461 | -4.65 | -12.35 | 170.06 | 170.81 |
| 89.49588477366255 | -4.07 | -12.66 | 172.39 | 173.13 |
| 89.67078189300413 | -3.62 | -13 | 175.17 | 175.91 |
| 89.83539094650206 | -3.08 | -13.37 | 177.96 | 178.69 |
| 90.0 | -2.48 | -13.68 | 181.19 | 181.91 |
| 90.16460905349794 | -1.98 | -13.82 | 185.33 | 186.04 |
| 90.32921810699588 | -1.57 | -13.81 | 190.04 | 190.72 |
| 90.50411522633745 | -1.14 | -13.64 | 195.2 | 195.84 |
| 90.66872427983539 | -0.71 | -13.25 | 201.43 | 202.04 |
| 90.83333333333334 | -0.13 | -12.7 | 208.83 | 209.37 |
| 90.99794238683127 | 0.35 | -11.91 | 216.91 | 217.4 |
| 91.16255144032922 | 0.75 | -10.82 | 225.6 | 226.05 |
| 91.33744855967079 | 1.15 | -9.54 | 235.04 | 235.43 |
| 91.50205761316873 | 1.56 | -8.27 | 245.08 | 245.43 |
| 91.66666666666666 | 1.99 | -7 | 255.49 | 255.79 |
| 91.8312757201646 | 2.43 | -5.55 | 266.1 | 266.37 |
| 91.99588477366255 | 2.71 | -3.95 | 277.5 | 277.73 |
| 92.17078189300412 | 2.61 | -2.29 | 290.01 | 290.21 |
| 92.33539094650206 | 2.41 | -0.7 | 302.93 | 303.1 |
| 92.5 | 2.21 | 1.06 | 316.39 | 316.54 |
| 92.66460905349794 | 2.03 | 2.78 | 330.02 | 330.17 |
| 92.8292181069959 | 1.86 | 4.36 | 343.47 | 343.63 |
| 93.00411522633746 | 1.84 | 6.1 | 356.98 | 357.16 |
| 93.1687242798354 | 1.84 | 7.69 | 370.3 | 370.5 |
| 93.33333333333333 | 1.79 | 9.44 | 383.86 | 384.1 |
| 93.49794238683128 | 1.72 | 11.21 | 397.57 | 397.86 |
| 93.66255144032921 | 1.63 | 13.21 | 411.73 | 412.07 |
| 93.83744855967079 | 1.62 | 15.3 | 425.4 | 425.81 |
| 94.00205761316872 | 1.76 | 17.39 | 438.66 | 439.15 |
| 94.16666666666667 | 2.03 | 19.32 | 450.84 | 451.4 |
| 94.33127572016461 | 2.48 | 20.56 | 461.41 | 462.02 |
| 94.49588477366255 | 2.77 | 22.23 | 473.17 | 473.84 |
| 94.67078189300412 | 2.93 | 24.27 | 486.57 | 487.32 |
| 94.83539094650206 | 3.03 | 26.25 | 501.22 | 502.04 |
| 95.0 | 2.89 | 28.89 | 517.68 | 518.6 |
| 95.16460905349794 | 2.8 | 31.39 | 534.18 | 535.22 |
| 95.32921810699588 | 2.82 | 33.62 | 549.93 | 551.07 |
| 95.50411522633745 | 3.05 | 35.75 | 564.24 | 565.49 |
| 95.66872427983539 | 3.45 | 37.77 | 577.77 | 579.12 |
| 95.83333333333334 | 3.82 | 38.71 | 589.61 | 591 |
| 95.99794238683128 | 4.27 | 39.82 | 601.89 | 603.32 |
| 96.16255144032922 | 4.8 | 40.74 | 613.72 | 615.19 |
| 96.33744855967079 | 5.3 | 41.4 | 625.39 | 626.87 |
| 96.50205761316873 | 5.74 | 41.84 | 636.01 | 637.5 |
| 96.66666666666666 | 6.21 | 42.07 | 644.47 | 645.95 |
| 96.83127572016461 | 6.63 | 41.92 | 651.86 | 653.32 |
| 96.99588477366255 | 7.06 | 41.76 | 658.45 | 659.88 |
| 97.17078189300412 | 7.46 | 41.72 | 664.91 | 666.32 |
| 97.33539094650206 | 7.8 | 41.82 | 671.33 | 672.74 |
| 97.5 | 8.01 | 42.16 | 678.62 | 680.03 |
| 97.66460905349795 | 8.12 | 42.79 | 687.55 | 688.99 |
| 97.8292181069959 | 8.07 | 43.41 | 697.71 | 699.16 |
| 98.00411522633746 | 7.89 | 43.98 | 708.37 | 709.84 |
| 98.1687242798354 | 7.51 | 44.8 | 718.7 | 720.2 |
| 98.33333333333333 | 7.13 | 45.35 | 727.15 | 728.66 |
| 98.49794238683128 | 7.02 | 45.9 | 733.81 | 735.36 |
| 98.66255144032921 | 7.27 | 46.45 | 738.19 | 739.78 |
| 98.83744855967078 | 7.67 | 47.43 | 742.22 | 743.87 |
| 99.00205761316873 | 7.92 | 48.23 | 745.7 | 747.4 |
| 99.16666666666667 | 8.04 | 48.8 | 748.4 | 750.13 |
| 99.33127572016461 | 8.15 | 49.3 | 750.98 | 752.73 |
| 99.49588477366255 | 8.27 | 49.82 | 753.15 | 754.93 |
| 99.67078189300412 | 8.22 | 50.09 | 754.2 | 755.99 |
| 99.83539094650207 | 8.15 | 50.4 | 755.57 | 757.38 |
| 100.0 | 8.06 | 50.83 | 758.25 | 760.09 |